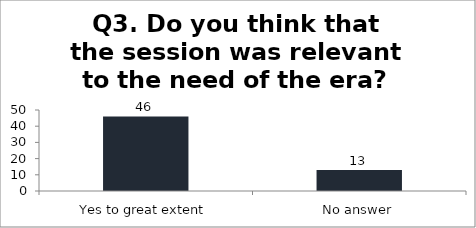
| Category | Q3. Do you think that the session was relevant to the need of the era? |
|---|---|
| Yes to great extent | 46 |
| No answer | 13 |